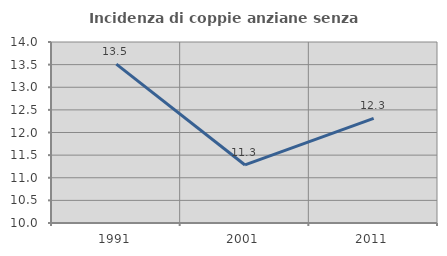
| Category | Incidenza di coppie anziane senza figli  |
|---|---|
| 1991.0 | 13.51 |
| 2001.0 | 11.283 |
| 2011.0 | 12.313 |